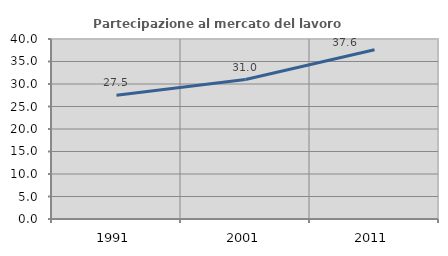
| Category | Partecipazione al mercato del lavoro  femminile |
|---|---|
| 1991.0 | 27.508 |
| 2001.0 | 30.993 |
| 2011.0 | 37.598 |